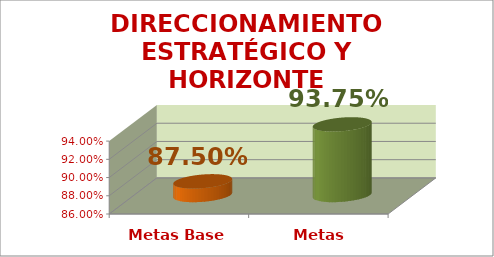
| Category | DIRECCIONAMIENTO ESTRATÉGICO Y HORIZONTE INSTITUCIONAL |
|---|---|
| Metas Base | 0.875 |
| Metas Esperadas | 0.938 |